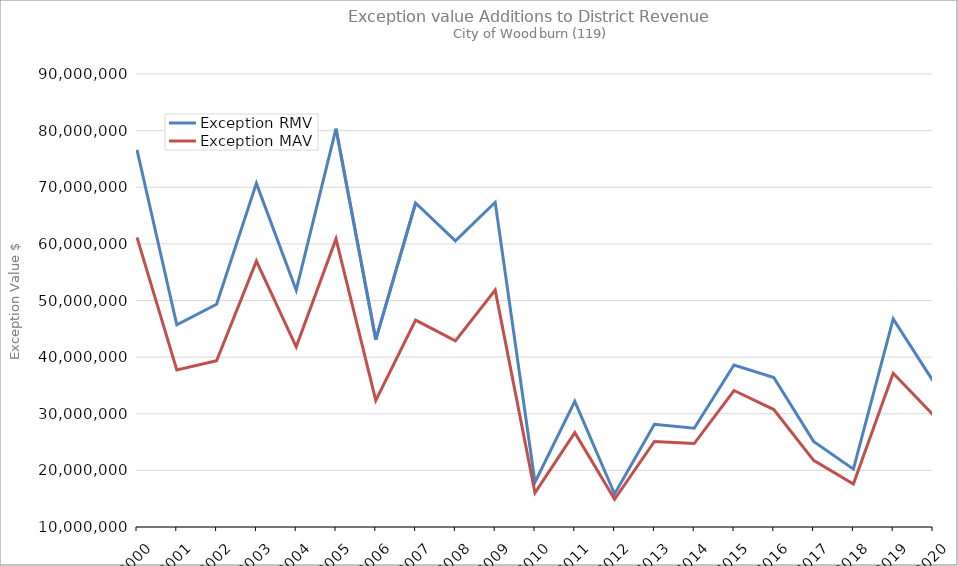
| Category | Exception RMV | Exception MAV |
|---|---|---|
| 2000.0 | 76604363 | 61149481 |
| 2001.0 | 45713011 | 37736485 |
| 2002.0 | 49341543 | 39367724 |
| 2003.0 | 70686377 | 56950607 |
| 2004.0 | 51820755 | 41808694 |
| 2005.0 | 80338252 | 60885682 |
| 2006.0 | 43090727 | 32372886 |
| 2007.0 | 67212939 | 46544914 |
| 2008.0 | 60527605 | 42862597 |
| 2009.0 | 67343303 | 51832572 |
| 2010.0 | 17904027 | 16046084 |
| 2011.0 | 32183748 | 26658970 |
| 2012.0 | 15830700 | 14888233 |
| 2013.0 | 28145326 | 25095753 |
| 2014.0 | 27435457 | 24733578 |
| 2015.0 | 38596444 | 34103863 |
| 2016.0 | 36401534 | 30744382 |
| 2017.0 | 25118295 | 21776250 |
| 2018.0 | 20219026 | 17596630 |
| 2019.0 | 46760364 | 37152441 |
| 2020.0 | 35811979 | 29835330 |